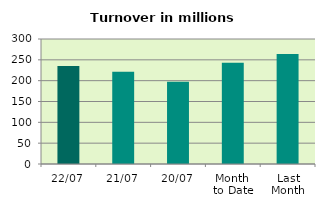
| Category | Series 0 |
|---|---|
| 22/07 | 235.23 |
| 21/07 | 221.648 |
| 20/07 | 197.19 |
| Month 
to Date | 242.738 |
| Last
Month | 264.074 |